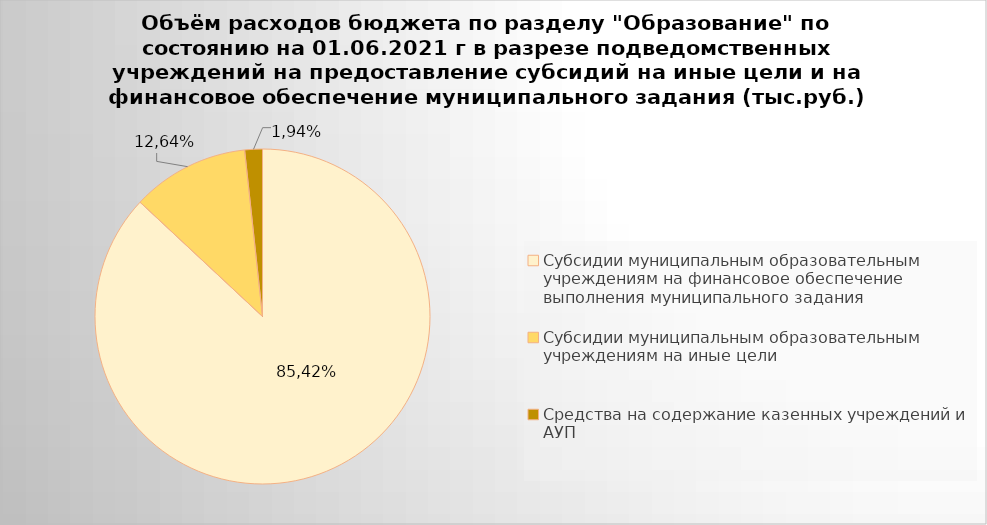
| Category | Series 0 |
|---|---|
| Субсидии муниципальным образовательным учреждениям на финансовое обеспечение выполнения муниципального задания | 5182540.04 |
| Субсидии муниципальным образовательным учреждениям на иные цели | 676087.51 |
| Средства на содержание казенных учреждений и АУП | 101574.31 |